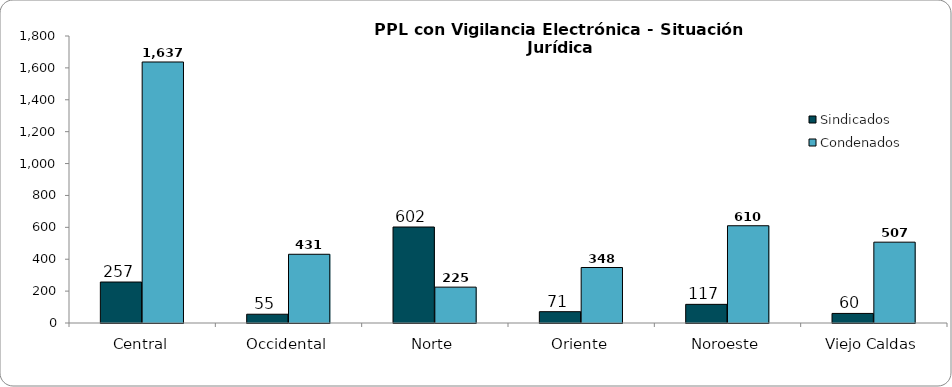
| Category | Sindicados | Condenados |
|---|---|---|
| Central | 257 | 1637 |
| Occidental | 55 | 431 |
| Norte | 602 | 225 |
| Oriente | 71 | 348 |
| Noroeste | 117 | 610 |
| Viejo Caldas | 60 | 507 |